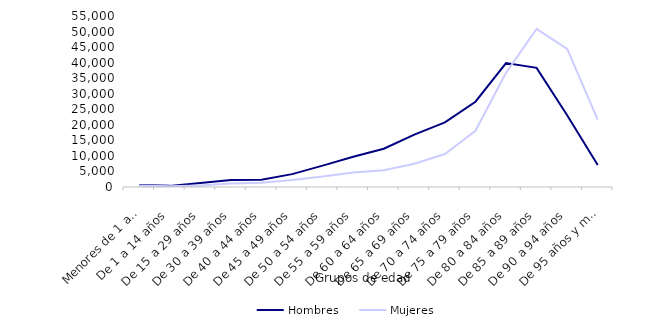
| Category | Hombres | Mujeres |
|---|---|---|
| Menores de 1 año | 634 | 505 |
| De 1 a 14 años | 363 | 266 |
| De 15 a 29 años | 1263 | 511 |
| De 30 a 39 años | 2269 | 1107 |
| De 40 a 44 años | 2339 | 1344 |
| De 45 a 49 años | 4134 | 2225 |
| De 50 a 54 años | 6878 | 3403 |
| De 55 a 59 años | 9749 | 4688 |
| De 60 a 64 años | 12300 | 5372 |
| De 65 a 69 años | 16827 | 7501 |
| De 70 a 74 años | 20787 | 10590 |
| De 75 a 79 años | 27433 | 18089 |
| De 80 a 84 años | 39870 | 36743 |
| De 85 a 89 años | 38320 | 50832 |
| De 90 a 94 años | 23095 | 44415 |
| De 95 años y más | 7048 | 21668 |